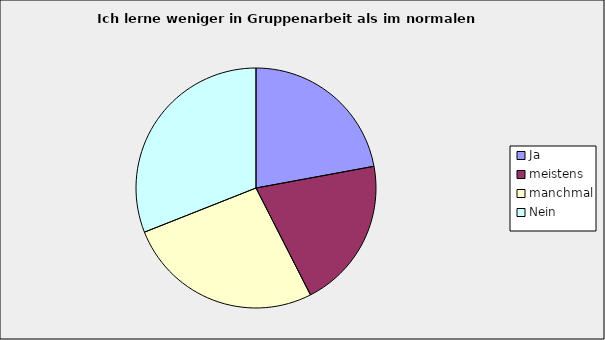
| Category | Series 0 |
|---|---|
| Ja | 0.221 |
| meistens | 0.204 |
| manchmal | 0.265 |
| Nein | 0.31 |